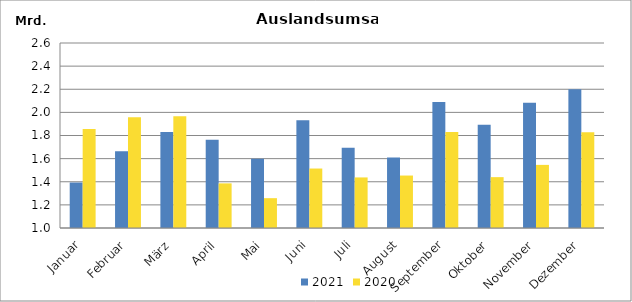
| Category | 2021 | 2020 |
|---|---|---|
| Januar | 1393309.24 | 1855871.742 |
| Februar | 1664851.878 | 1958662.994 |
| März | 1831103.175 | 1965451.408 |
| April | 1763852.687 | 1385973.601 |
| Mai | 1599164.919 | 1257950.559 |
| Juni | 1932739.277 | 1514331.33 |
| Juli | 1693396.763 | 1437366.144 |
| August | 1610341.004 | 1453730.382 |
| September | 2088786.707 | 1830426.537 |
| Oktober | 1892719.306 | 1439856.176 |
| November | 2083174.719 | 1545849.034 |
| Dezember | 2200389.881 | 1828509.233 |